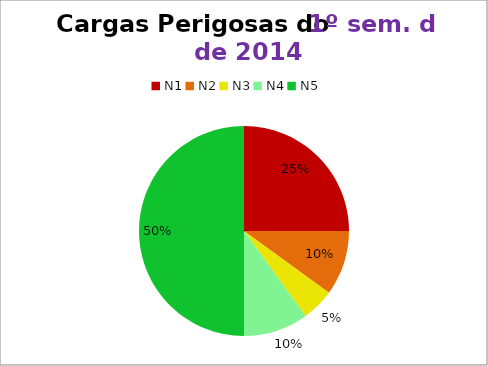
| Category | 1º/14 |
|---|---|
| N1 | 5 |
| N2 | 2 |
| N3 | 1 |
| N4 | 2 |
| N5 | 10 |